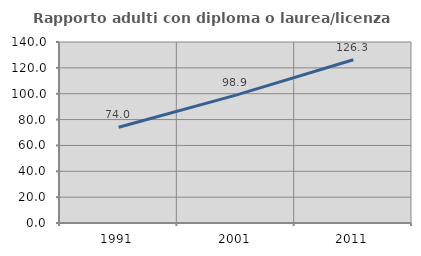
| Category | Rapporto adulti con diploma o laurea/licenza media  |
|---|---|
| 1991.0 | 74.006 |
| 2001.0 | 98.908 |
| 2011.0 | 126.27 |